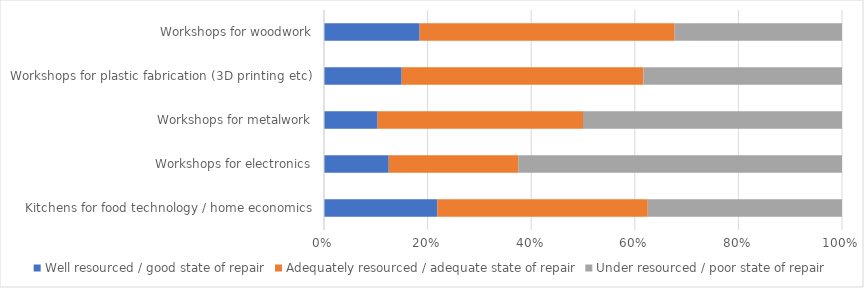
| Category | Well resourced / good state of repair | Adequately resourced / adequate state of repair | Under resourced / poor state of repair |
|---|---|---|---|
| Kitchens for food technology / home economics | 0.219 | 0.406 | 0.375 |
| Workshops for electronics | 0.125 | 0.25 | 0.625 |
| Workshops for metalwork | 0.103 | 0.397 | 0.5 |
| Workshops for plastic fabrication (3D printing etc) | 0.15 | 0.467 | 0.383 |
| Workshops for woodwork | 0.185 | 0.492 | 0.323 |